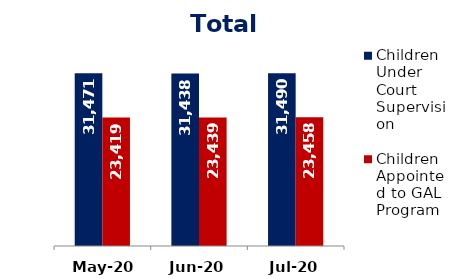
| Category | Children Under Court Supervision  | Children Appointed to GAL Program  |
|---|---|---|
| May-20 | 31471 | 23419 |
| Jun-20 | 31438 | 23439 |
| Jul-20 | 31490 | 23458 |